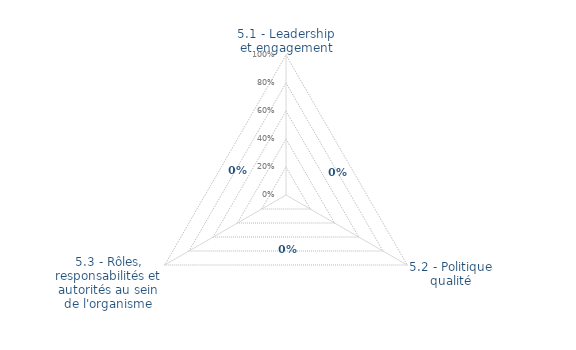
| Category | Art. 5 | limite de CONFORMITÉ |
|---|---|---|
| 5.1 - Leadership et engagement | 0 | 0 |
| 5.2 - Politique qualité | 0 | 0 |
| 5.3 - Rôles, responsabilités et autorités au sein de l'organisme | 0 | 0 |